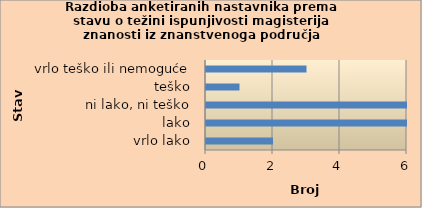
| Category | Series 0 |
|---|---|
| vrlo lako | 2 |
| lako | 6 |
| ni lako, ni teško | 6 |
| teško | 1 |
| vrlo teško ili nemoguće | 3 |